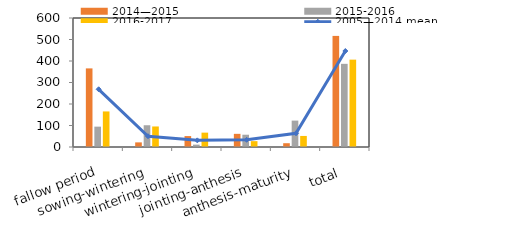
| Category | 2014—2015 | 2015-2016 | 2016-2017 |
|---|---|---|---|
| fallow period | 365.6 | 94.7 | 165.4 |
| sowing-wintering | 21.5 | 101.2 | 95.5 |
| wintering-jointing | 50.8 | 11 | 66.8 |
| jointing-anthesis | 61.2 | 57.1 | 27.2 |
| anthesis-maturity | 17.6 | 122.8 | 51.4 |
| total | 516.7 | 386.8 | 406.3 |